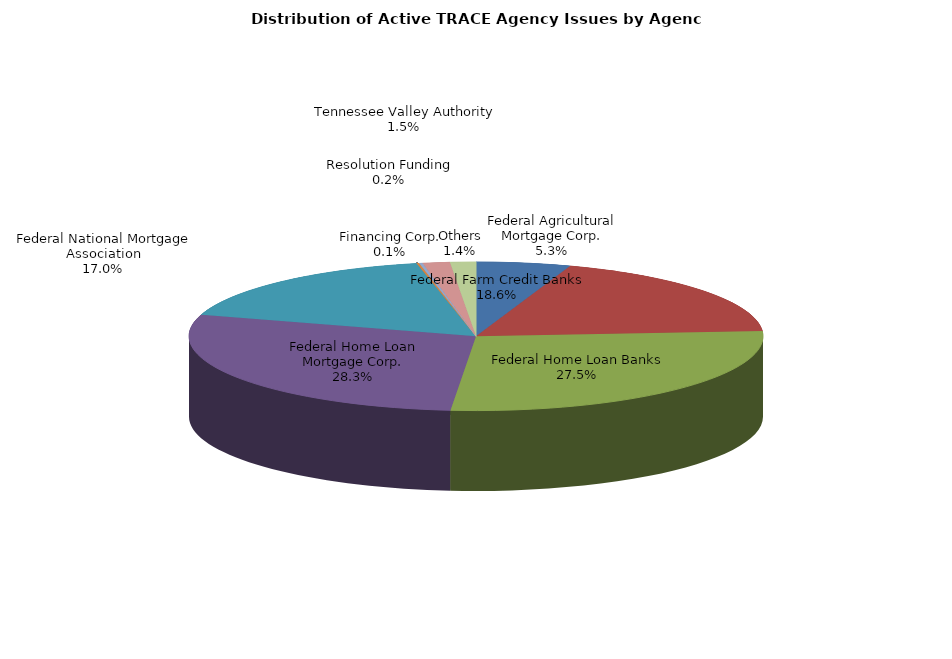
| Category | Series 0 |
|---|---|
| Federal Agricultural Mortgage Corp. | 1651 |
| Federal Farm Credit Banks | 5771 |
| Federal Home Loan Banks | 8552 |
| Federal Home Loan Mortgage Corp. | 8778 |
| Federal National Mortgage Association | 5287 |
| Financing Corp. | 45 |
| Resolution Funding | 59 |
| Tennessee Valley Authority | 475 |
| Others | 450 |